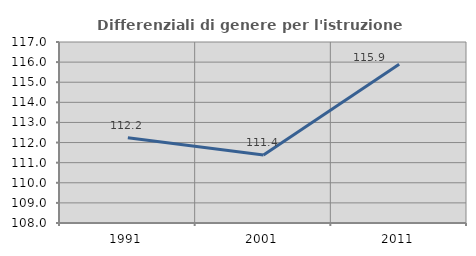
| Category | Differenziali di genere per l'istruzione superiore |
|---|---|
| 1991.0 | 112.242 |
| 2001.0 | 111.382 |
| 2011.0 | 115.9 |